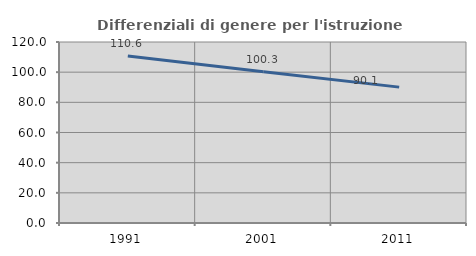
| Category | Differenziali di genere per l'istruzione superiore |
|---|---|
| 1991.0 | 110.643 |
| 2001.0 | 100.317 |
| 2011.0 | 90.084 |